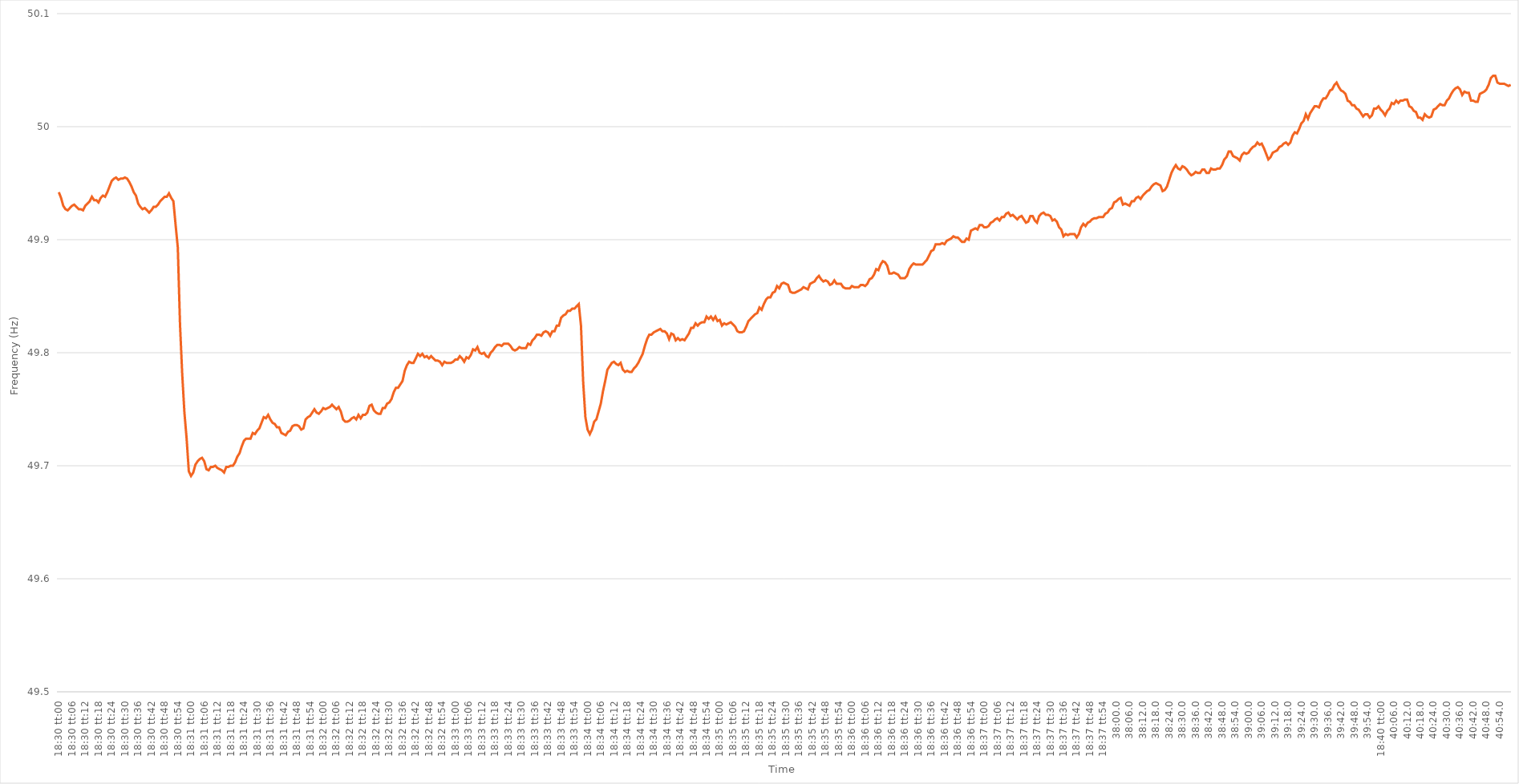
| Category | Series 0 |
|---|---|
| 0.7708333333333334 | 49.942 |
| 0.7708449074074074 | 49.937 |
| 0.7708564814814814 | 49.93 |
| 0.7708680555555555 | 49.927 |
| 0.7708796296296296 | 49.926 |
| 0.7708912037037038 | 49.928 |
| 0.7709027777777777 | 49.93 |
| 0.7709143518518519 | 49.931 |
| 0.7709259259259259 | 49.929 |
| 0.7709375 | 49.927 |
| 0.770949074074074 | 49.927 |
| 0.7709606481481481 | 49.926 |
| 0.7709722222222223 | 49.93 |
| 0.7709837962962963 | 49.932 |
| 0.7709953703703704 | 49.934 |
| 0.7710069444444444 | 49.938 |
| 0.7710185185185185 | 49.935 |
| 0.7710300925925927 | 49.935 |
| 0.7710416666666666 | 49.933 |
| 0.7710532407407408 | 49.937 |
| 0.7710648148148148 | 49.939 |
| 0.771076388888889 | 49.938 |
| 0.7710879629629629 | 49.942 |
| 0.771099537037037 | 49.947 |
| 0.7711111111111112 | 49.952 |
| 0.7711226851851851 | 49.954 |
| 0.7711342592592593 | 49.955 |
| 0.7711458333333333 | 49.953 |
| 0.7711574074074075 | 49.954 |
| 0.7711689814814814 | 49.954 |
| 0.7711805555555555 | 49.955 |
| 0.7711921296296297 | 49.954 |
| 0.7712037037037037 | 49.951 |
| 0.7712152777777778 | 49.947 |
| 0.7712268518518518 | 49.942 |
| 0.771238425925926 | 49.939 |
| 0.7712500000000001 | 49.932 |
| 0.771261574074074 | 49.929 |
| 0.7712731481481482 | 49.927 |
| 0.7712847222222222 | 49.928 |
| 0.7712962962962964 | 49.926 |
| 0.7713078703703703 | 49.924 |
| 0.7713194444444444 | 49.926 |
| 0.7713310185185186 | 49.929 |
| 0.7713425925925925 | 49.929 |
| 0.7713541666666667 | 49.931 |
| 0.7713657407407407 | 49.934 |
| 0.7713773148148149 | 49.936 |
| 0.7713888888888888 | 49.938 |
| 0.7714004629629629 | 49.938 |
| 0.7714120370370371 | 49.941 |
| 0.7714236111111111 | 49.937 |
| 0.7714351851851852 | 49.934 |
| 0.7714467592592592 | 49.913 |
| 0.7714583333333334 | 49.893 |
| 0.7714699074074075 | 49.825 |
| 0.7714814814814814 | 49.781 |
| 0.7714930555555556 | 49.747 |
| 0.7715046296296296 | 49.724 |
| 0.7715162037037038 | 49.695 |
| 0.7715277777777777 | 49.691 |
| 0.7715393518518519 | 49.694 |
| 0.771550925925926 | 49.701 |
| 0.7715624999999999 | 49.704 |
| 0.7715740740740741 | 49.706 |
| 0.7715856481481481 | 49.707 |
| 0.7715972222222223 | 49.704 |
| 0.7716087962962962 | 49.697 |
| 0.7716203703703703 | 49.696 |
| 0.7716319444444445 | 49.699 |
| 0.7716435185185185 | 49.699 |
| 0.7716550925925926 | 49.7 |
| 0.7716666666666666 | 49.698 |
| 0.7716782407407408 | 49.697 |
| 0.7716898148148149 | 49.696 |
| 0.7717013888888888 | 49.694 |
| 0.771712962962963 | 49.699 |
| 0.771724537037037 | 49.699 |
| 0.7717361111111112 | 49.7 |
| 0.7717476851851851 | 49.7 |
| 0.7717592592592593 | 49.703 |
| 0.7717708333333334 | 49.708 |
| 0.7717824074074073 | 49.711 |
| 0.7717939814814815 | 49.717 |
| 0.7718055555555555 | 49.722 |
| 0.7718171296296297 | 49.724 |
| 0.7718287037037036 | 49.724 |
| 0.7718402777777778 | 49.724 |
| 0.7718518518518519 | 49.729 |
| 0.7718634259259259 | 49.728 |
| 0.771875 | 49.731 |
| 0.771886574074074 | 49.733 |
| 0.7718981481481482 | 49.738 |
| 0.7719097222222223 | 49.743 |
| 0.7719212962962962 | 49.742 |
| 0.7719328703703704 | 49.745 |
| 0.7719444444444444 | 49.741 |
| 0.7719560185185186 | 49.738 |
| 0.7719675925925925 | 49.737 |
| 0.7719791666666667 | 49.734 |
| 0.7719907407407408 | 49.734 |
| 0.7720023148148148 | 49.729 |
| 0.7720138888888889 | 49.728 |
| 0.7720254629629629 | 49.727 |
| 0.7720370370370371 | 49.73 |
| 0.772048611111111 | 49.731 |
| 0.7720601851851852 | 49.735 |
| 0.7720717592592593 | 49.736 |
| 0.7720833333333333 | 49.736 |
| 0.7720949074074074 | 49.735 |
| 0.7721064814814814 | 49.732 |
| 0.7721180555555556 | 49.733 |
| 0.7721296296296297 | 49.741 |
| 0.7721412037037036 | 49.743 |
| 0.7721527777777778 | 49.744 |
| 0.7721643518518518 | 49.747 |
| 0.772175925925926 | 49.75 |
| 0.7721874999999999 | 49.747 |
| 0.7721990740740741 | 49.746 |
| 0.7722106481481482 | 49.748 |
| 0.7722222222222223 | 49.751 |
| 0.7722337962962963 | 49.75 |
| 0.7722453703703703 | 49.751 |
| 0.7722569444444445 | 49.752 |
| 0.7722685185185186 | 49.754 |
| 0.7722800925925926 | 49.752 |
| 0.7722916666666667 | 49.75 |
| 0.7723032407407407 | 49.752 |
| 0.7723148148148148 | 49.748 |
| 0.7723263888888888 | 49.741 |
| 0.772337962962963 | 49.739 |
| 0.7723495370370371 | 49.739 |
| 0.772361111111111 | 49.74 |
| 0.7723726851851852 | 49.742 |
| 0.7723842592592592 | 49.743 |
| 0.7723958333333334 | 49.741 |
| 0.7724074074074073 | 49.745 |
| 0.7724189814814815 | 49.742 |
| 0.7724305555555556 | 49.745 |
| 0.7724421296296297 | 49.745 |
| 0.7724537037037037 | 49.747 |
| 0.7724652777777777 | 49.753 |
| 0.7724768518518519 | 49.754 |
| 0.772488425925926 | 49.749 |
| 0.7725 | 49.747 |
| 0.7725115740740741 | 49.746 |
| 0.7725231481481482 | 49.746 |
| 0.7725347222222222 | 49.751 |
| 0.7725462962962962 | 49.751 |
| 0.7725578703703704 | 49.755 |
| 0.7725694444444445 | 49.756 |
| 0.7725810185185185 | 49.759 |
| 0.7725925925925926 | 49.765 |
| 0.7726041666666666 | 49.769 |
| 0.7726157407407408 | 49.769 |
| 0.7726273148148147 | 49.772 |
| 0.7726388888888889 | 49.775 |
| 0.772650462962963 | 49.784 |
| 0.7726620370370371 | 49.789 |
| 0.7726736111111111 | 49.792 |
| 0.7726851851851851 | 49.791 |
| 0.7726967592592593 | 49.791 |
| 0.7727083333333334 | 49.795 |
| 0.7727199074074074 | 49.799 |
| 0.7727314814814815 | 49.797 |
| 0.7727430555555556 | 49.799 |
| 0.7727546296296296 | 49.796 |
| 0.7727662037037036 | 49.797 |
| 0.7727777777777778 | 49.795 |
| 0.7727893518518519 | 49.797 |
| 0.7728009259259259 | 49.795 |
| 0.7728125 | 49.793 |
| 0.772824074074074 | 49.793 |
| 0.7728356481481482 | 49.792 |
| 0.7728472222222221 | 49.789 |
| 0.7728587962962963 | 49.792 |
| 0.7728703703703704 | 49.791 |
| 0.7728819444444445 | 49.791 |
| 0.7728935185185185 | 49.791 |
| 0.7729050925925925 | 49.792 |
| 0.7729166666666667 | 49.794 |
| 0.7729282407407408 | 49.794 |
| 0.7729398148148148 | 49.797 |
| 0.7729513888888889 | 49.795 |
| 0.772962962962963 | 49.792 |
| 0.772974537037037 | 49.796 |
| 0.772986111111111 | 49.795 |
| 0.7729976851851852 | 49.798 |
| 0.7730092592592593 | 49.803 |
| 0.7730208333333333 | 49.802 |
| 0.7730324074074074 | 49.805 |
| 0.7730439814814815 | 49.8 |
| 0.7730555555555556 | 49.799 |
| 0.7730671296296295 | 49.8 |
| 0.7730787037037037 | 49.797 |
| 0.7730902777777778 | 49.796 |
| 0.7731018518518519 | 49.8 |
| 0.7731134259259259 | 49.802 |
| 0.773125 | 49.805 |
| 0.7731365740740741 | 49.807 |
| 0.7731481481481483 | 49.807 |
| 0.7731597222222222 | 49.806 |
| 0.7731712962962963 | 49.808 |
| 0.7731828703703704 | 49.808 |
| 0.7731944444444444 | 49.808 |
| 0.7732060185185184 | 49.806 |
| 0.7732175925925926 | 49.803 |
| 0.7732291666666667 | 49.802 |
| 0.7732407407407407 | 49.803 |
| 0.7732523148148148 | 49.805 |
| 0.7732638888888889 | 49.804 |
| 0.773275462962963 | 49.804 |
| 0.7732870370370369 | 49.804 |
| 0.7732986111111111 | 49.808 |
| 0.7733101851851852 | 49.807 |
| 0.7733217592592593 | 49.811 |
| 0.7733333333333333 | 49.813 |
| 0.7733449074074074 | 49.816 |
| 0.7733564814814815 | 49.816 |
| 0.7733680555555557 | 49.815 |
| 0.7733796296296296 | 49.818 |
| 0.7733912037037037 | 49.819 |
| 0.7734027777777778 | 49.818 |
| 0.7734143518518519 | 49.815 |
| 0.7734259259259259 | 49.819 |
| 0.7734375 | 49.819 |
| 0.7734490740740741 | 49.824 |
| 0.7734606481481481 | 49.824 |
| 0.7734722222222222 | 49.831 |
| 0.7734837962962963 | 49.833 |
| 0.7734953703703704 | 49.834 |
| 0.7735069444444443 | 49.837 |
| 0.7735185185185185 | 49.837 |
| 0.7735300925925926 | 49.839 |
| 0.7735416666666667 | 49.839 |
| 0.7735532407407407 | 49.841 |
| 0.7735648148148148 | 49.843 |
| 0.7735763888888889 | 49.824 |
| 0.7735879629629631 | 49.774 |
| 0.773599537037037 | 49.743 |
| 0.7736111111111111 | 49.732 |
| 0.7736226851851852 | 49.728 |
| 0.7736342592592593 | 49.732 |
| 0.7736458333333333 | 49.739 |
| 0.7736574074074074 | 49.741 |
| 0.7736689814814816 | 49.748 |
| 0.7736805555555556 | 49.755 |
| 0.7736921296296296 | 49.766 |
| 0.7737037037037037 | 49.775 |
| 0.7737152777777778 | 49.785 |
| 0.7737268518518517 | 49.788 |
| 0.7737384259259259 | 49.791 |
| 0.77375 | 49.792 |
| 0.7737615740740741 | 49.79 |
| 0.7737731481481481 | 49.789 |
| 0.7737847222222222 | 49.791 |
| 0.7737962962962963 | 49.785 |
| 0.7738078703703705 | 49.783 |
| 0.7738194444444444 | 49.784 |
| 0.7738310185185185 | 49.783 |
| 0.7738425925925926 | 49.783 |
| 0.7738541666666667 | 49.786 |
| 0.7738657407407407 | 49.788 |
| 0.7738773148148148 | 49.791 |
| 0.773888888888889 | 49.795 |
| 0.773900462962963 | 49.799 |
| 0.773912037037037 | 49.806 |
| 0.7739236111111111 | 49.812 |
| 0.7739351851851852 | 49.816 |
| 0.7739467592592592 | 49.816 |
| 0.7739583333333333 | 49.818 |
| 0.7739699074074075 | 49.819 |
| 0.7739814814814815 | 49.82 |
| 0.7739930555555555 | 49.821 |
| 0.7740046296296296 | 49.819 |
| 0.7740162037037037 | 49.819 |
| 0.7740277777777779 | 49.817 |
| 0.7740393518518518 | 49.812 |
| 0.774050925925926 | 49.817 |
| 0.7740625 | 49.816 |
| 0.7740740740740741 | 49.811 |
| 0.7740856481481481 | 49.813 |
| 0.7740972222222222 | 49.811 |
| 0.7741087962962964 | 49.812 |
| 0.7741203703703704 | 49.811 |
| 0.7741319444444444 | 49.814 |
| 0.7741435185185185 | 49.817 |
| 0.7741550925925926 | 49.822 |
| 0.7741666666666666 | 49.822 |
| 0.7741782407407407 | 49.826 |
| 0.7741898148148149 | 49.824 |
| 0.7742013888888889 | 49.826 |
| 0.7742129629629629 | 49.827 |
| 0.774224537037037 | 49.827 |
| 0.7742361111111111 | 49.832 |
| 0.7742476851851853 | 49.83 |
| 0.7742592592592592 | 49.832 |
| 0.7742708333333334 | 49.829 |
| 0.7742824074074074 | 49.832 |
| 0.7742939814814815 | 49.828 |
| 0.7743055555555555 | 49.829 |
| 0.7743171296296296 | 49.824 |
| 0.7743287037037038 | 49.826 |
| 0.7743402777777778 | 49.825 |
| 0.7743518518518518 | 49.826 |
| 0.7743634259259259 | 49.827 |
| 0.774375 | 49.825 |
| 0.774386574074074 | 49.823 |
| 0.7743981481481481 | 49.819 |
| 0.7744097222222223 | 49.818 |
| 0.7744212962962963 | 49.818 |
| 0.7744328703703703 | 49.819 |
| 0.7744444444444444 | 49.823 |
| 0.7744560185185185 | 49.828 |
| 0.7744675925925927 | 49.83 |
| 0.7744791666666666 | 49.832 |
| 0.7744907407407408 | 49.834 |
| 0.7745023148148148 | 49.835 |
| 0.774513888888889 | 49.84 |
| 0.7745254629629629 | 49.838 |
| 0.774537037037037 | 49.843 |
| 0.7745486111111112 | 49.847 |
| 0.7745601851851852 | 49.849 |
| 0.7745717592592593 | 49.849 |
| 0.7745833333333333 | 49.853 |
| 0.7745949074074074 | 49.854 |
| 0.7746064814814814 | 49.859 |
| 0.7746180555555555 | 49.857 |
| 0.7746296296296297 | 49.861 |
| 0.7746412037037037 | 49.862 |
| 0.7746527777777777 | 49.861 |
| 0.7746643518518518 | 49.86 |
| 0.7746759259259259 | 49.854 |
| 0.7746875000000001 | 49.853 |
| 0.774699074074074 | 49.853 |
| 0.7747106481481482 | 49.854 |
| 0.7747222222222222 | 49.855 |
| 0.7747337962962964 | 49.856 |
| 0.7747453703703703 | 49.858 |
| 0.7747569444444444 | 49.857 |
| 0.7747685185185186 | 49.856 |
| 0.7747800925925926 | 49.861 |
| 0.7747916666666667 | 49.862 |
| 0.7748032407407407 | 49.863 |
| 0.7748148148148148 | 49.866 |
| 0.774826388888889 | 49.868 |
| 0.7748379629629629 | 49.865 |
| 0.7748495370370371 | 49.863 |
| 0.7748611111111111 | 49.864 |
| 0.7748726851851853 | 49.863 |
| 0.7748842592592592 | 49.86 |
| 0.7748958333333333 | 49.861 |
| 0.7749074074074075 | 49.864 |
| 0.7749189814814814 | 49.861 |
| 0.7749305555555556 | 49.861 |
| 0.7749421296296296 | 49.861 |
| 0.7749537037037038 | 49.858 |
| 0.7749652777777777 | 49.857 |
| 0.7749768518518518 | 49.857 |
| 0.774988425925926 | 49.857 |
| 0.775 | 49.859 |
| 0.7750115740740741 | 49.858 |
| 0.7750231481481481 | 49.858 |
| 0.7750347222222222 | 49.858 |
| 0.7750462962962964 | 49.86 |
| 0.7750578703703703 | 49.86 |
| 0.7750694444444445 | 49.859 |
| 0.7750810185185185 | 49.861 |
| 0.7750925925925927 | 49.865 |
| 0.7751041666666666 | 49.866 |
| 0.7751157407407407 | 49.869 |
| 0.7751273148148149 | 49.874 |
| 0.7751388888888888 | 49.873 |
| 0.775150462962963 | 49.878 |
| 0.775162037037037 | 49.881 |
| 0.7751736111111112 | 49.88 |
| 0.7751851851851851 | 49.877 |
| 0.7751967592592592 | 49.87 |
| 0.7752083333333334 | 49.87 |
| 0.7752199074074074 | 49.871 |
| 0.7752314814814815 | 49.87 |
| 0.7752430555555555 | 49.869 |
| 0.7752546296296297 | 49.866 |
| 0.7752662037037038 | 49.866 |
| 0.7752777777777777 | 49.866 |
| 0.7752893518518519 | 49.868 |
| 0.7753009259259259 | 49.874 |
| 0.7753125000000001 | 49.877 |
| 0.775324074074074 | 49.879 |
| 0.7753356481481481 | 49.878 |
| 0.7753472222222223 | 49.878 |
| 0.7753587962962962 | 49.878 |
| 0.7753703703703704 | 49.878 |
| 0.7753819444444444 | 49.88 |
| 0.7753935185185186 | 49.882 |
| 0.7754050925925925 | 49.886 |
| 0.7754166666666666 | 49.89 |
| 0.7754282407407408 | 49.891 |
| 0.7754398148148148 | 49.896 |
| 0.7754513888888889 | 49.896 |
| 0.7754629629629629 | 49.896 |
| 0.7754745370370371 | 49.897 |
| 0.7754861111111112 | 49.896 |
| 0.7754976851851851 | 49.899 |
| 0.7755092592592593 | 49.9 |
| 0.7755208333333333 | 49.901 |
| 0.7755324074074075 | 49.903 |
| 0.7755439814814814 | 49.902 |
| 0.7755555555555556 | 49.902 |
| 0.7755671296296297 | 49.9 |
| 0.7755787037037036 | 49.898 |
| 0.7755902777777778 | 49.898 |
| 0.7756018518518518 | 49.901 |
| 0.775613425925926 | 49.9 |
| 0.7756249999999999 | 49.908 |
| 0.775636574074074 | 49.909 |
| 0.7756481481481482 | 49.91 |
| 0.7756597222222222 | 49.909 |
| 0.7756712962962963 | 49.913 |
| 0.7756828703703703 | 49.913 |
| 0.7756944444444445 | 49.911 |
| 0.7757060185185186 | 49.911 |
| 0.7757175925925925 | 49.912 |
| 0.7757291666666667 | 49.915 |
| 0.7757407407407407 | 49.916 |
| 0.7757523148148149 | 49.918 |
| 0.7757638888888888 | 49.919 |
| 0.775775462962963 | 49.917 |
| 0.7757870370370371 | 49.92 |
| 0.775798611111111 | 49.92 |
| 0.7758101851851852 | 49.923 |
| 0.7758217592592592 | 49.924 |
| 0.7758333333333334 | 49.921 |
| 0.7758449074074073 | 49.922 |
| 0.7758564814814815 | 49.92 |
| 0.7758680555555556 | 49.918 |
| 0.7758796296296296 | 49.92 |
| 0.7758912037037037 | 49.921 |
| 0.7759027777777777 | 49.918 |
| 0.7759143518518519 | 49.915 |
| 0.775925925925926 | 49.916 |
| 0.7759375 | 49.921 |
| 0.7759490740740741 | 49.921 |
| 0.7759606481481481 | 49.917 |
| 0.7759722222222223 | 49.915 |
| 0.7759837962962962 | 49.921 |
| 0.7759953703703704 | 49.923 |
| 0.7760069444444445 | 49.924 |
| 0.7760185185185186 | 49.922 |
| 0.7760300925925926 | 49.922 |
| 0.7760416666666666 | 49.921 |
| 0.7760532407407408 | 49.917 |
| 0.7760648148148147 | 49.918 |
| 0.7760763888888889 | 49.916 |
| 0.776087962962963 | 49.911 |
| 0.776099537037037 | 49.909 |
| 0.7761111111111111 | 49.903 |
| 0.7761226851851851 | 49.905 |
| 0.7761342592592593 | 49.904 |
| 0.7761458333333334 | 49.905 |
| 0.7761574074074074 | 49.905 |
| 0.7761689814814815 | 49.905 |
| 0.7761805555555555 | 49.902 |
| 0.7761921296296297 | 49.905 |
| 0.7762037037037036 | 49.911 |
| 0.7762152777777778 | 49.914 |
| 0.7762268518518519 | 49.912 |
| 0.776238425925926 | 49.915 |
| 0.77625 | 49.916 |
| 0.776261574074074 | 49.918 |
| 0.7762731481481482 | 49.919 |
| 0.7762847222222223 | 49.919 |
| 0.7762962962962963 | 49.92 |
| 0.7763078703703704 | 49.92 |
| 0.7763194444444445 | 49.92 |
| 0.7763310185185185 | 49.923 |
| 0.7763425925925925 | 49.924 |
| 0.7763541666666667 | 49.927 |
| 0.7763657407407408 | 49.928 |
| 0.7763773148148148 | 49.933 |
| 0.7763888888888889 | 49.934 |
| 0.776400462962963 | 49.936 |
| 0.7764120370370371 | 49.937 |
| 0.776423611111111 | 49.931 |
| 0.7764351851851852 | 49.932 |
| 0.7764467592592593 | 49.931 |
| 0.7764583333333334 | 49.93 |
| 0.7764699074074074 | 49.934 |
| 0.7764814814814814 | 49.934 |
| 0.7764930555555556 | 49.937 |
| 0.7765046296296297 | 49.938 |
| 0.7765162037037037 | 49.936 |
| 0.7765277777777778 | 49.939 |
| 0.7765393518518519 | 49.941 |
| 0.7765509259259259 | 49.943 |
| 0.7765624999999999 | 49.944 |
| 0.7765740740740741 | 49.947 |
| 0.7765856481481482 | 49.949 |
| 0.7765972222222222 | 49.95 |
| 0.7766087962962963 | 49.949 |
| 0.7766203703703703 | 49.948 |
| 0.7766319444444445 | 49.943 |
| 0.7766435185185184 | 49.944 |
| 0.7766550925925926 | 49.947 |
| 0.7766666666666667 | 49.953 |
| 0.7766782407407408 | 49.959 |
| 0.7766898148148148 | 49.963 |
| 0.7767013888888888 | 49.966 |
| 0.776712962962963 | 49.963 |
| 0.7767245370370371 | 49.962 |
| 0.7767361111111111 | 49.965 |
| 0.7767476851851852 | 49.964 |
| 0.7767592592592593 | 49.962 |
| 0.7767708333333333 | 49.959 |
| 0.7767824074074073 | 49.957 |
| 0.7767939814814815 | 49.958 |
| 0.7768055555555556 | 49.96 |
| 0.7768171296296296 | 49.959 |
| 0.7768287037037037 | 49.959 |
| 0.7768402777777778 | 49.962 |
| 0.7768518518518519 | 49.962 |
| 0.7768634259259258 | 49.959 |
| 0.776875 | 49.959 |
| 0.7768865740740741 | 49.963 |
| 0.7768981481481482 | 49.962 |
| 0.7769097222222222 | 49.962 |
| 0.7769212962962962 | 49.963 |
| 0.7769328703703704 | 49.963 |
| 0.7769444444444445 | 49.966 |
| 0.7769560185185185 | 49.971 |
| 0.7769675925925926 | 49.973 |
| 0.7769791666666667 | 49.978 |
| 0.7769907407407407 | 49.978 |
| 0.7770023148148147 | 49.974 |
| 0.7770138888888889 | 49.973 |
| 0.777025462962963 | 49.972 |
| 0.777037037037037 | 49.97 |
| 0.7770486111111111 | 49.975 |
| 0.7770601851851852 | 49.977 |
| 0.7770717592592593 | 49.976 |
| 0.7770833333333332 | 49.977 |
| 0.7770949074074074 | 49.98 |
| 0.7771064814814815 | 49.982 |
| 0.7771180555555556 | 49.983 |
| 0.7771296296296296 | 49.986 |
| 0.7771412037037037 | 49.984 |
| 0.7771527777777778 | 49.985 |
| 0.777164351851852 | 49.981 |
| 0.7771759259259259 | 49.976 |
| 0.7771875 | 49.971 |
| 0.7771990740740741 | 49.973 |
| 0.7772106481481481 | 49.977 |
| 0.7772222222222221 | 49.978 |
| 0.7772337962962963 | 49.979 |
| 0.7772453703703704 | 49.982 |
| 0.7772569444444444 | 49.983 |
| 0.7772685185185185 | 49.985 |
| 0.7772800925925926 | 49.986 |
| 0.7772916666666667 | 49.984 |
| 0.7773032407407406 | 49.986 |
| 0.7773148148148148 | 49.992 |
| 0.7773263888888889 | 49.995 |
| 0.777337962962963 | 49.994 |
| 0.777349537037037 | 49.998 |
| 0.7773611111111111 | 50.003 |
| 0.7773726851851852 | 50.005 |
| 0.7773842592592594 | 50.011 |
| 0.7773958333333333 | 50.007 |
| 0.7774074074074074 | 50.012 |
| 0.7774189814814815 | 50.015 |
| 0.7774305555555556 | 50.018 |
| 0.7774421296296296 | 50.018 |
| 0.7774537037037037 | 50.017 |
| 0.7774652777777779 | 50.022 |
| 0.7774768518518519 | 50.025 |
| 0.7774884259259259 | 50.025 |
| 0.7775 | 50.028 |
| 0.7775115740740741 | 50.032 |
| 0.777523148148148 | 50.033 |
| 0.7775347222222222 | 50.037 |
| 0.7775462962962963 | 50.039 |
| 0.7775578703703704 | 50.035 |
| 0.7775694444444444 | 50.032 |
| 0.7775810185185185 | 50.031 |
| 0.7775925925925926 | 50.029 |
| 0.7776041666666668 | 50.023 |
| 0.7776157407407407 | 50.022 |
| 0.7776273148148148 | 50.019 |
| 0.7776388888888889 | 50.019 |
| 0.777650462962963 | 50.016 |
| 0.777662037037037 | 50.015 |
| 0.7776736111111111 | 50.012 |
| 0.7776851851851853 | 50.009 |
| 0.7776967592592593 | 50.011 |
| 0.7777083333333333 | 50.011 |
| 0.7777199074074074 | 50.008 |
| 0.7777314814814815 | 50.01 |
| 0.7777430555555555 | 50.016 |
| 0.7777546296296296 | 50.016 |
| 0.7777662037037038 | 50.018 |
| 0.7777777777777778 | 50.015 |
| 0.7777893518518518 | 50.013 |
| 0.7778009259259259 | 50.01 |
| 0.7778125 | 50.014 |
| 0.7778240740740742 | 50.016 |
| 0.7778356481481481 | 50.021 |
| 0.7778472222222222 | 50.02 |
| 0.7778587962962963 | 50.023 |
| 0.7778703703703704 | 50.021 |
| 0.7778819444444444 | 50.023 |
| 0.7778935185185185 | 50.023 |
| 0.7779050925925927 | 50.024 |
| 0.7779166666666667 | 50.024 |
| 0.7779282407407407 | 50.018 |
| 0.7779398148148148 | 50.017 |
| 0.7779513888888889 | 50.014 |
| 0.7779629629629629 | 50.013 |
| 0.777974537037037 | 50.008 |
| 0.7779861111111112 | 50.008 |
| 0.7779976851851852 | 50.006 |
| 0.7780092592592592 | 50.011 |
| 0.7780208333333333 | 50.009 |
| 0.7780324074074074 | 50.008 |
| 0.7780439814814816 | 50.009 |
| 0.7780555555555555 | 50.015 |
| 0.7780671296296297 | 50.016 |
| 0.7780787037037037 | 50.018 |
| 0.7780902777777778 | 50.02 |
| 0.7781018518518518 | 50.019 |
| 0.7781134259259259 | 50.019 |
| 0.7781250000000001 | 50.023 |
| 0.7781365740740741 | 50.025 |
| 0.7781481481481481 | 50.029 |
| 0.7781597222222222 | 50.032 |
| 0.7781712962962963 | 50.034 |
| 0.7781828703703703 | 50.035 |
| 0.7781944444444444 | 50.033 |
| 0.7782060185185186 | 50.028 |
| 0.7782175925925926 | 50.031 |
| 0.7782291666666666 | 50.03 |
| 0.7782407407407407 | 50.03 |
| 0.7782523148148148 | 50.023 |
| 0.778263888888889 | 50.023 |
| 0.7782754629629629 | 50.022 |
| 0.778287037037037 | 50.022 |
| 0.7782986111111111 | 50.029 |
| 0.7783101851851852 | 50.03 |
| 0.7783217592592592 | 50.031 |
| 0.7783333333333333 | 50.033 |
| 0.7783449074074075 | 50.037 |
| 0.7783564814814815 | 50.043 |
| 0.7783680555555555 | 50.045 |
| 0.7783796296296296 | 50.045 |
| 0.7783912037037037 | 50.039 |
| 0.7784027777777777 | 50.038 |
| 0.7784143518518518 | 50.038 |
| 0.778425925925926 | 50.038 |
| 0.7784375 | 50.037 |
| 0.778449074074074 | 50.036 |
| 0.7784606481481481 | 50.037 |